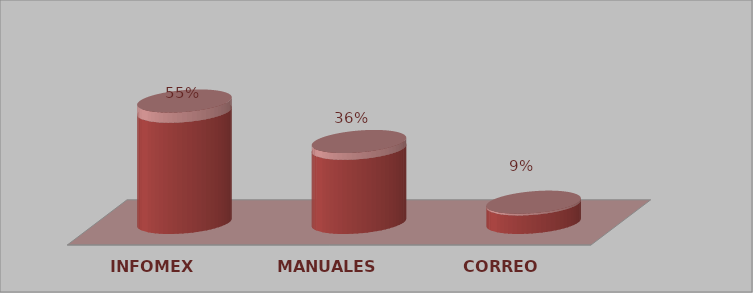
| Category | Series 0 | Series 1 |
|---|---|---|
| INFOMEX | 6 | 0.545 |
| MANUALES | 4 | 0.364 |
| CORREO | 1 | 0.091 |